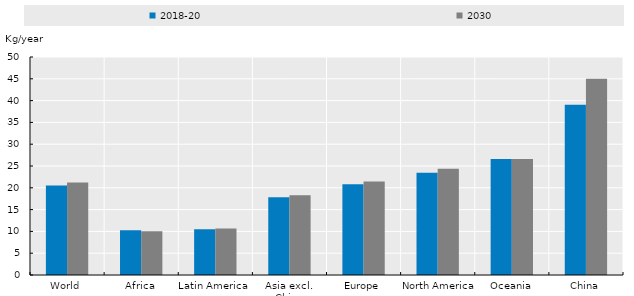
| Category | 2018-20 | 2030 |
|---|---|---|
| World | 20.5 | 21.229 |
| Africa | 10.238 | 10.011 |
| Latin America | 10.472 | 10.662 |
| Asia excl. China | 17.838 | 18.282 |
| Europe | 20.786 | 21.435 |
| North America | 23.443 | 24.343 |
| Oceania | 26.595 | 26.603 |
| China | 39.051 | 45.021 |